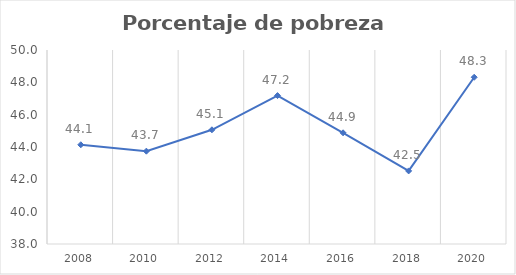
| Category | Series 0 |
|---|---|
| 2008.0 | 44.138 |
| 2010.0 | 43.742 |
| 2012.0 | 45.064 |
| 2014.0 | 47.182 |
| 2016.0 | 44.877 |
| 2018.0 | 42.521 |
| 2020.0 | 48.315 |